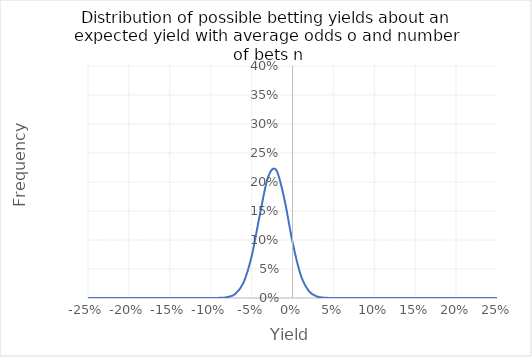
| Category | Frequency |
|---|---|
| -0.25 | 0 |
| -0.24 | 0 |
| -0.22999999999999998 | 0 |
| -0.21999999999999997 | 0 |
| -0.20999999999999996 | 0 |
| -0.19999999999999996 | 0 |
| -0.18999999999999995 | 0 |
| -0.17999999999999994 | 0 |
| -0.16999999999999993 | 0 |
| -0.15999999999999992 | 0 |
| -0.1499999999999999 | 0 |
| -0.1399999999999999 | 0 |
| -0.1299999999999999 | 0 |
| -0.1199999999999999 | 0 |
| -0.1099999999999999 | 0 |
| -0.09999999999999991 | 0 |
| -0.08999999999999991 | 0 |
| -0.07999999999999992 | 0.001 |
| -0.06999999999999992 | 0.007 |
| -0.05999999999999992 | 0.026 |
| -0.04999999999999992 | 0.072 |
| -0.03999999999999992 | 0.143 |
| -0.029999999999999916 | 0.208 |
| -0.019999999999999914 | 0.221 |
| -0.009999999999999913 | 0.171 |
| 8.673617379884035e-17 | 0.097 |
| 0.010000000000000087 | 0.04 |
| 0.020000000000000087 | 0.012 |
| 0.03000000000000009 | 0.003 |
| 0.04000000000000009 | 0 |
| 0.05000000000000009 | 0 |
| 0.060000000000000095 | 0 |
| 0.07000000000000009 | 0 |
| 0.08000000000000008 | 0 |
| 0.09000000000000008 | 0 |
| 0.10000000000000007 | 0 |
| 0.11000000000000007 | 0 |
| 0.12000000000000006 | 0 |
| 0.13000000000000006 | 0 |
| 0.14000000000000007 | 0 |
| 0.15000000000000008 | 0 |
| 0.1600000000000001 | 0 |
| 0.1700000000000001 | 0 |
| 0.1800000000000001 | 0 |
| 0.1900000000000001 | 0 |
| 0.20000000000000012 | 0 |
| 0.21000000000000013 | 0 |
| 0.22000000000000014 | 0 |
| 0.23000000000000015 | 0 |
| 0.24000000000000016 | 0 |
| 0.25000000000000017 | 0 |